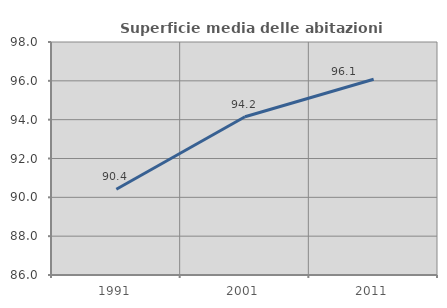
| Category | Superficie media delle abitazioni occupate |
|---|---|
| 1991.0 | 90.413 |
| 2001.0 | 94.151 |
| 2011.0 | 96.079 |